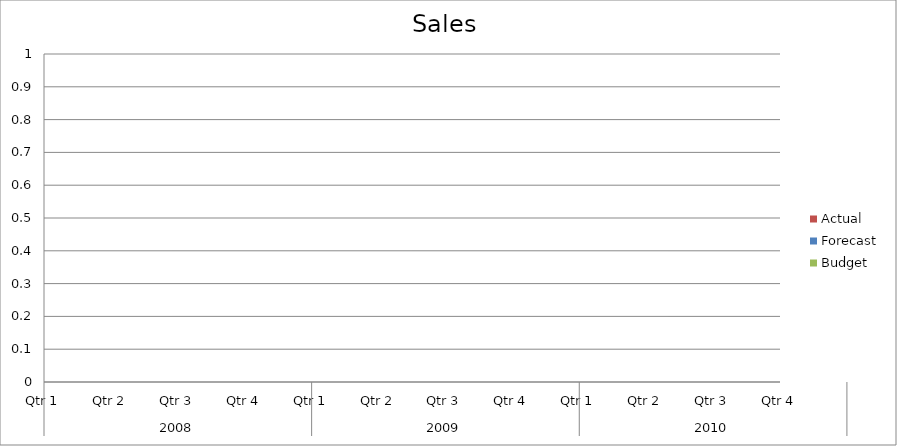
| Category | Budget | Forecast | Actual |
|---|---|---|---|
| 0 | 1380 | 3300 | 1110 |
| 1 | 2410 | 2930 | 2150 |
| 2 | 1020 | 1970 | 1120 |
| 3 | 870 | 2790 | 2010 |
| 4 | 1750 | 2930 | 3260 |
| 5 | 2810 | 1230 | 1420 |
| 6 | 630 | 1330 | 2200 |
| 7 | 3040 | 610 | 1740 |
| 8 | 3220 | 1870 | 590 |
| 9 | 3020 | 1750 | 3070 |
| 10 | 770 | 3470 | 2610 |
| 11 | 3430 | 1970 | 3480 |